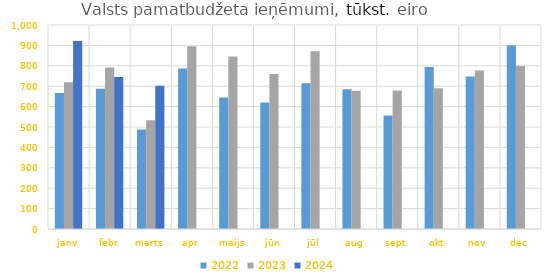
| Category | 2022 | 2023 | 2024 |
|---|---|---|---|
| janv | 666661.352 | 719939.35 | 921874.013 |
| febr | 687779.931 | 791517.955 | 745501.692 |
| marts | 487592.334 | 533224.214 | 701863.549 |
| apr | 787062.79 | 895993.736 | 0 |
| maijs | 644004.073 | 845157.912 | 0 |
| jūn | 620273.485 | 760374.013 | 0 |
| jūl | 713962.301 | 871539.884 | 0 |
| aug | 685067.765 | 678022.747 | 0 |
| sept | 556332.319 | 678643.792 | 0 |
| okt | 794230.202 | 689799.53 | 0 |
| nov | 747989.336 | 777169.422 | 0 |
| dec | 900960.999 | 799044.443 | 0 |